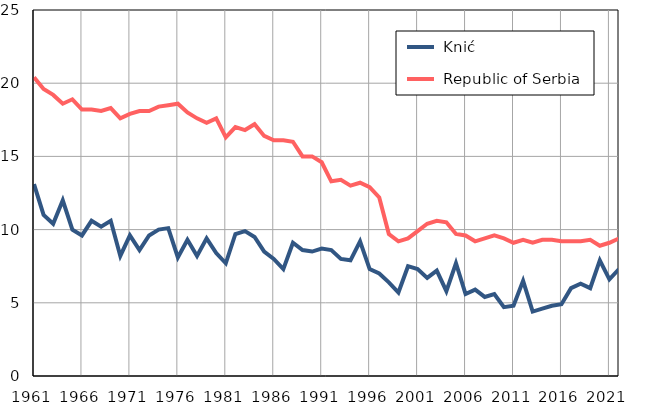
| Category |  Knić |  Republic of Serbia |
|---|---|---|
| 1961.0 | 13.1 | 20.4 |
| 1962.0 | 11 | 19.6 |
| 1963.0 | 10.4 | 19.2 |
| 1964.0 | 12 | 18.6 |
| 1965.0 | 10 | 18.9 |
| 1966.0 | 9.6 | 18.2 |
| 1967.0 | 10.6 | 18.2 |
| 1968.0 | 10.2 | 18.1 |
| 1969.0 | 10.6 | 18.3 |
| 1970.0 | 8.2 | 17.6 |
| 1971.0 | 9.6 | 17.9 |
| 1972.0 | 8.6 | 18.1 |
| 1973.0 | 9.6 | 18.1 |
| 1974.0 | 10 | 18.4 |
| 1975.0 | 10.1 | 18.5 |
| 1976.0 | 8.1 | 18.6 |
| 1977.0 | 9.3 | 18 |
| 1978.0 | 8.2 | 17.6 |
| 1979.0 | 9.4 | 17.3 |
| 1980.0 | 8.4 | 17.6 |
| 1981.0 | 7.7 | 16.3 |
| 1982.0 | 9.7 | 17 |
| 1983.0 | 9.9 | 16.8 |
| 1984.0 | 9.5 | 17.2 |
| 1985.0 | 8.5 | 16.4 |
| 1986.0 | 8 | 16.1 |
| 1987.0 | 7.3 | 16.1 |
| 1988.0 | 9.1 | 16 |
| 1989.0 | 8.6 | 15 |
| 1990.0 | 8.5 | 15 |
| 1991.0 | 8.7 | 14.6 |
| 1992.0 | 8.6 | 13.3 |
| 1993.0 | 8 | 13.4 |
| 1994.0 | 7.9 | 13 |
| 1995.0 | 9.2 | 13.2 |
| 1996.0 | 7.3 | 12.9 |
| 1997.0 | 7 | 12.2 |
| 1998.0 | 6.4 | 9.7 |
| 1999.0 | 5.7 | 9.2 |
| 2000.0 | 7.5 | 9.4 |
| 2001.0 | 7.3 | 9.9 |
| 2002.0 | 6.7 | 10.4 |
| 2003.0 | 7.2 | 10.6 |
| 2004.0 | 5.8 | 10.5 |
| 2005.0 | 7.7 | 9.7 |
| 2006.0 | 5.6 | 9.6 |
| 2007.0 | 5.9 | 9.2 |
| 2008.0 | 5.4 | 9.4 |
| 2009.0 | 5.6 | 9.6 |
| 2010.0 | 4.7 | 9.4 |
| 2011.0 | 4.8 | 9.1 |
| 2012.0 | 6.5 | 9.3 |
| 2013.0 | 4.4 | 9.1 |
| 2014.0 | 4.6 | 9.3 |
| 2015.0 | 4.8 | 9.3 |
| 2016.0 | 4.9 | 9.2 |
| 2017.0 | 6 | 9.2 |
| 2018.0 | 6.3 | 9.2 |
| 2019.0 | 6 | 9.3 |
| 2020.0 | 7.9 | 8.9 |
| 2021.0 | 6.6 | 9.1 |
| 2022.0 | 7.3 | 9.4 |